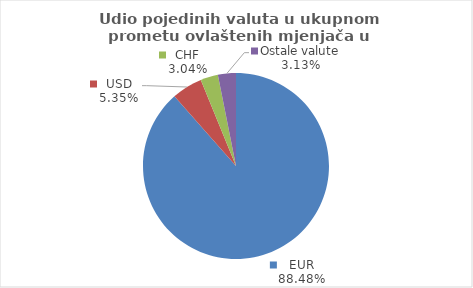
| Category | Series 0 |
|---|---|
| EUR | 88.476 |
| USD | 5.35 |
| CHF | 3.045 |
| Ostale valute | 3.129 |